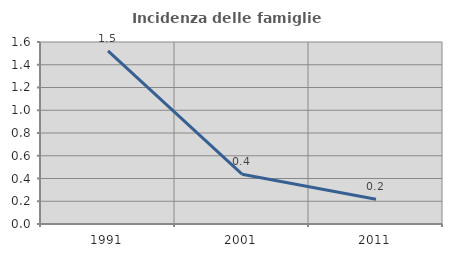
| Category | Incidenza delle famiglie numerose |
|---|---|
| 1991.0 | 1.523 |
| 2001.0 | 0.438 |
| 2011.0 | 0.218 |